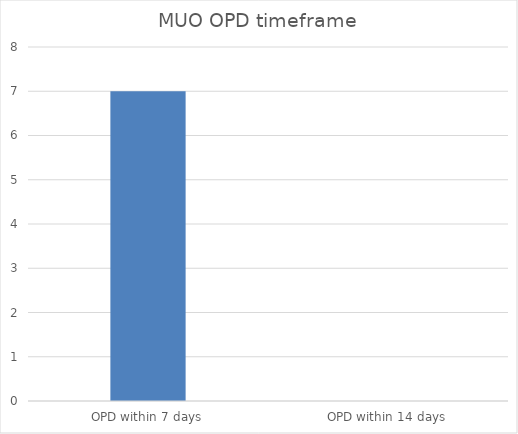
| Category | Series 0 |
|---|---|
| OPD within 7 days | 7 |
| OPD within 14 days | 0 |